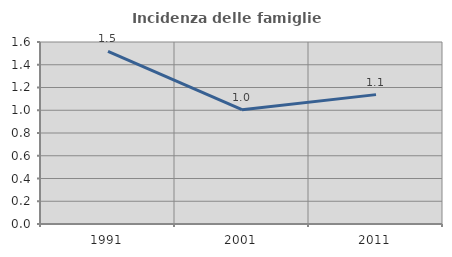
| Category | Incidenza delle famiglie numerose |
|---|---|
| 1991.0 | 1.517 |
| 2001.0 | 1.005 |
| 2011.0 | 1.137 |